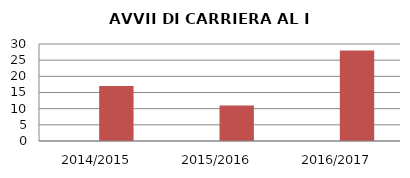
| Category | ANNO | NUMERO |
|---|---|---|
| 2014/2015 | 0 | 17 |
| 2015/2016 | 0 | 11 |
| 2016/2017 | 0 | 28 |